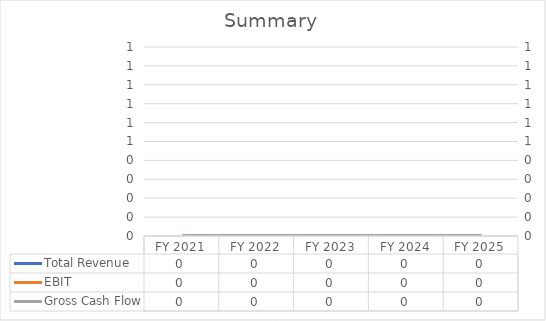
| Category | Total Revenue |
|---|---|
| FY 2021 | 0 |
| FY 2022 | 0 |
| FY 2023 | 0 |
| FY 2024 | 0 |
| FY 2025 | 0 |